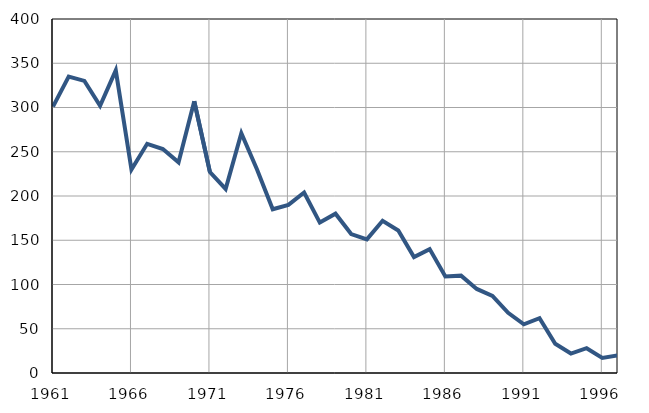
| Category | Infants
deaths |
|---|---|
| 1961.0 | 301 |
| 1962.0 | 335 |
| 1963.0 | 330 |
| 1964.0 | 302 |
| 1965.0 | 342 |
| 1966.0 | 230 |
| 1967.0 | 259 |
| 1968.0 | 253 |
| 1969.0 | 238 |
| 1970.0 | 307 |
| 1971.0 | 227 |
| 1972.0 | 208 |
| 1973.0 | 271 |
| 1974.0 | 230 |
| 1975.0 | 185 |
| 1976.0 | 190 |
| 1977.0 | 204 |
| 1978.0 | 170 |
| 1979.0 | 180 |
| 1980.0 | 157 |
| 1981.0 | 151 |
| 1982.0 | 172 |
| 1983.0 | 161 |
| 1984.0 | 131 |
| 1985.0 | 140 |
| 1986.0 | 109 |
| 1987.0 | 110 |
| 1988.0 | 95 |
| 1989.0 | 87 |
| 1990.0 | 68 |
| 1991.0 | 55 |
| 1992.0 | 62 |
| 1993.0 | 33 |
| 1994.0 | 22 |
| 1995.0 | 28 |
| 1996.0 | 17 |
| 1997.0 | 20 |